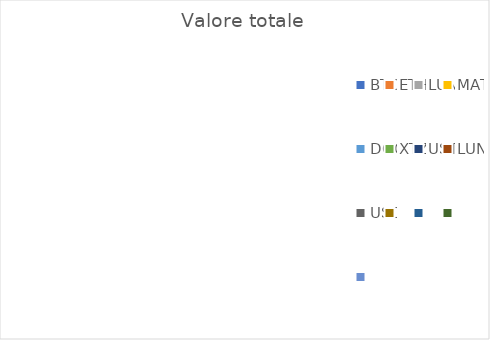
| Category | Valore totale |
|---|---|
| BTC | 0 |
| ETH | 0 |
| LUNA | 0 |
| MATIC | 0 |
| DOGE | 0 |
| XTZ | 0 |
| UST | 0 |
| LUNC | 0 |
| USDC | 0 |